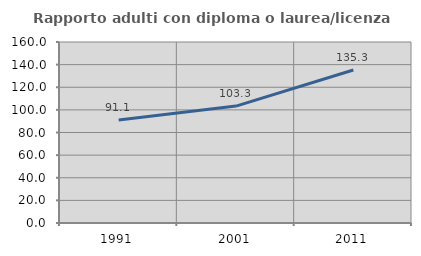
| Category | Rapporto adulti con diploma o laurea/licenza media  |
|---|---|
| 1991.0 | 91.078 |
| 2001.0 | 103.326 |
| 2011.0 | 135.283 |